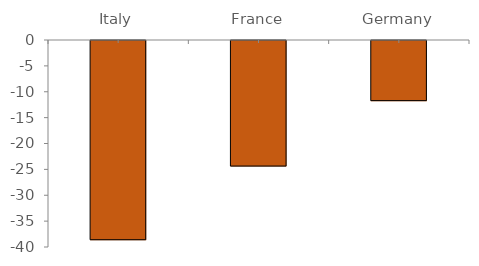
| Category | 2001-16 Change |
|---|---|
| Italy | -38.498 |
| France | -24.263 |
| Germany | -11.619 |